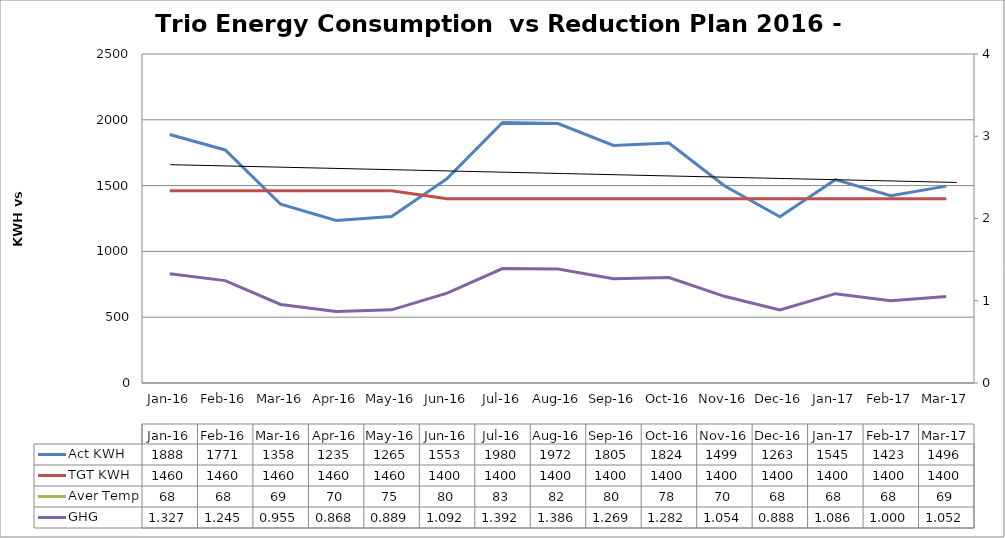
| Category | Act KWH | TGT KWH |
|---|---|---|
| 2016-01-01 | 1888 | 1460 |
| 2016-02-01 | 1771 | 1460 |
| 2016-03-01 | 1358 | 1460 |
| 2016-04-01 | 1235 | 1460 |
| 2016-05-01 | 1265 | 1460 |
| 2016-06-01 | 1553 | 1400 |
| 2016-07-02 | 1980 | 1400 |
| 2016-08-02 | 1972 | 1400 |
| 2016-09-02 | 1805 | 1400 |
| 2016-10-03 | 1824 | 1400 |
| 2016-11-03 | 1499 | 1400 |
| 2016-12-04 | 1263 | 1400 |
| 2017-01-04 | 1545 | 1400 |
| 2017-02-04 | 1423 | 1400 |
| 2017-03-07 | 1496 | 1400 |